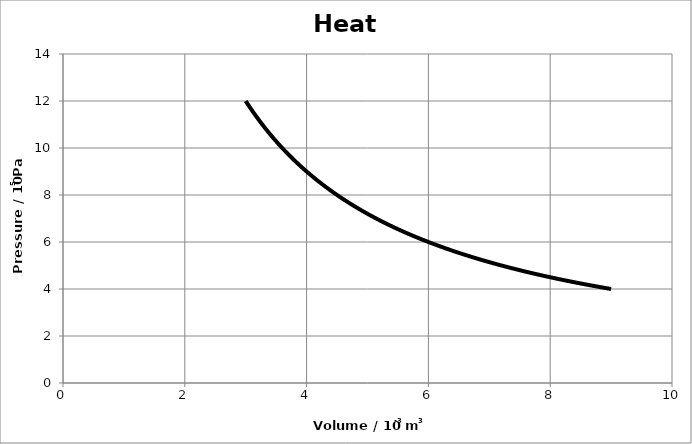
| Category | Series 0 |
|---|---|
| 3.0 | 12 |
| 3.06 | 11.765 |
| 3.12 | 11.538 |
| 3.18 | 11.321 |
| 3.24 | 11.111 |
| 3.3000000000000003 | 10.909 |
| 3.3600000000000003 | 10.714 |
| 3.4200000000000004 | 10.526 |
| 3.4800000000000004 | 10.345 |
| 3.5400000000000005 | 10.169 |
| 3.6000000000000005 | 10 |
| 3.6600000000000006 | 9.836 |
| 3.7200000000000006 | 9.677 |
| 3.7800000000000007 | 9.524 |
| 3.8400000000000007 | 9.375 |
| 3.900000000000001 | 9.231 |
| 3.960000000000001 | 9.091 |
| 4.0200000000000005 | 8.955 |
| 4.08 | 8.824 |
| 4.14 | 8.696 |
| 4.199999999999999 | 8.571 |
| 4.259999999999999 | 8.451 |
| 4.3199999999999985 | 8.333 |
| 4.379999999999998 | 8.219 |
| 4.439999999999998 | 8.108 |
| 4.499999999999997 | 8 |
| 4.559999999999997 | 7.895 |
| 4.6199999999999966 | 7.792 |
| 4.679999999999996 | 7.692 |
| 4.739999999999996 | 7.595 |
| 4.799999999999995 | 7.5 |
| 4.859999999999995 | 7.407 |
| 4.919999999999995 | 7.317 |
| 4.979999999999994 | 7.229 |
| 5.039999999999994 | 7.143 |
| 5.099999999999993 | 7.059 |
| 5.159999999999993 | 6.977 |
| 5.219999999999993 | 6.897 |
| 5.279999999999992 | 6.818 |
| 5.339999999999992 | 6.742 |
| 5.3999999999999915 | 6.667 |
| 5.459999999999991 | 6.593 |
| 5.519999999999991 | 6.522 |
| 5.57999999999999 | 6.452 |
| 5.63999999999999 | 6.383 |
| 5.6999999999999895 | 6.316 |
| 5.759999999999989 | 6.25 |
| 5.819999999999989 | 6.186 |
| 5.879999999999988 | 6.122 |
| 5.939999999999988 | 6.061 |
| 5.999999999999988 | 6 |
| 6.059999999999987 | 5.941 |
| 6.119999999999987 | 5.882 |
| 6.179999999999986 | 5.825 |
| 6.239999999999986 | 5.769 |
| 6.299999999999986 | 5.714 |
| 6.359999999999985 | 5.66 |
| 6.419999999999985 | 5.607 |
| 6.479999999999984 | 5.556 |
| 6.539999999999984 | 5.505 |
| 6.599999999999984 | 5.455 |
| 6.659999999999983 | 5.405 |
| 6.719999999999983 | 5.357 |
| 6.7799999999999825 | 5.31 |
| 6.839999999999982 | 5.263 |
| 6.899999999999982 | 5.217 |
| 6.959999999999981 | 5.172 |
| 7.019999999999981 | 5.128 |
| 7.0799999999999805 | 5.085 |
| 7.13999999999998 | 5.042 |
| 7.19999999999998 | 5 |
| 7.259999999999979 | 4.959 |
| 7.319999999999979 | 4.918 |
| 7.379999999999979 | 4.878 |
| 7.439999999999978 | 4.839 |
| 7.499999999999978 | 4.8 |
| 7.559999999999977 | 4.762 |
| 7.619999999999977 | 4.724 |
| 7.679999999999977 | 4.688 |
| 7.739999999999976 | 4.651 |
| 7.799999999999976 | 4.615 |
| 7.8599999999999755 | 4.58 |
| 7.919999999999975 | 4.545 |
| 7.979999999999975 | 4.511 |
| 8.039999999999974 | 4.478 |
| 8.099999999999975 | 4.444 |
| 8.159999999999975 | 4.412 |
| 8.219999999999976 | 4.38 |
| 8.279999999999976 | 4.348 |
| 8.339999999999977 | 4.317 |
| 8.399999999999977 | 4.286 |
| 8.459999999999978 | 4.255 |
| 8.519999999999978 | 4.225 |
| 8.579999999999979 | 4.196 |
| 8.63999999999998 | 4.167 |
| 8.69999999999998 | 4.138 |
| 8.75999999999998 | 4.11 |
| 8.81999999999998 | 4.082 |
| 8.879999999999981 | 4.054 |
| 8.939999999999982 | 4.027 |
| 8.999999999999982 | 4 |